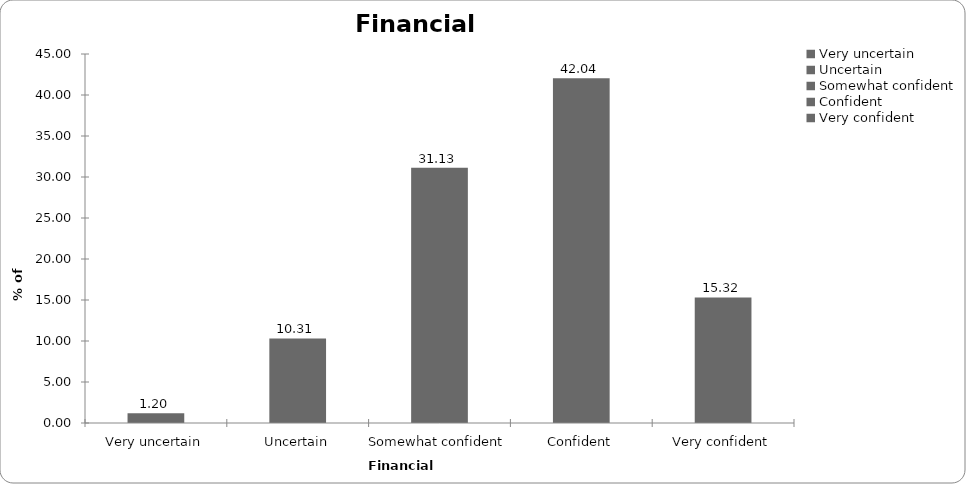
| Category | Financial confidence |
|---|---|
| Very uncertain | 1.201 |
| Uncertain | 10.31 |
| Somewhat confident | 31.131 |
| Confident | 42.042 |
| Very confident | 15.315 |